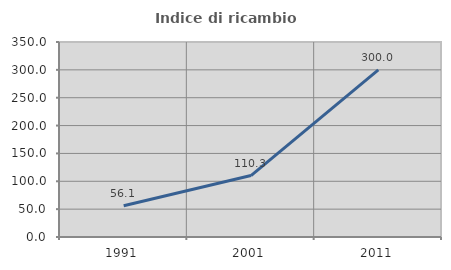
| Category | Indice di ricambio occupazionale  |
|---|---|
| 1991.0 | 56.098 |
| 2001.0 | 110.256 |
| 2011.0 | 300 |